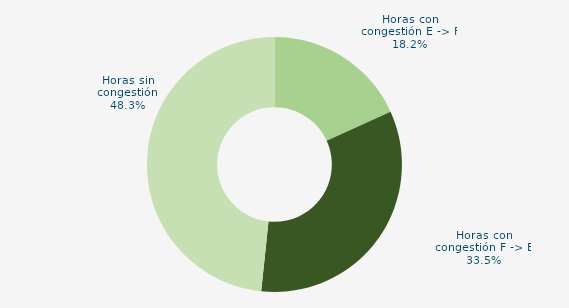
| Category | Horas con congestión E -> F |
|---|---|
| Horas con congestión E -> F | 18.194 |
| Horas con congestión F -> E | 33.472 |
| Horas sin congestión | 48.333 |